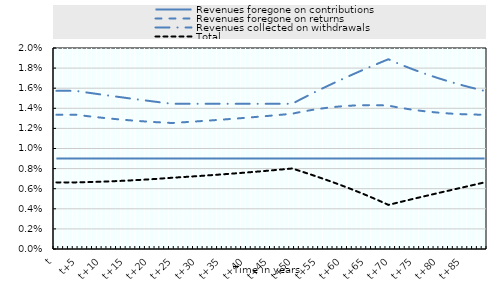
| Category | Revenues foregone on contributions | Revenues foregone on returns | Revenues collected on withdrawals | Total |
|---|---|---|---|---|
| t | 0.009 | 0.013 | 0.016 | 0.007 |
|  | 0.009 | 0.013 | 0.016 | 0.007 |
|  | 0.009 | 0.013 | 0.016 | 0.007 |
|  | 0.009 | 0.013 | 0.016 | 0.007 |
|  | 0.009 | 0.013 | 0.016 | 0.007 |
| t+5 | 0.009 | 0.013 | 0.016 | 0.007 |
|  | 0.009 | 0.013 | 0.016 | 0.007 |
|  | 0.009 | 0.013 | 0.016 | 0.007 |
|  | 0.009 | 0.013 | 0.015 | 0.007 |
|  | 0.009 | 0.013 | 0.015 | 0.007 |
| t+10 | 0.009 | 0.013 | 0.015 | 0.007 |
|  | 0.009 | 0.013 | 0.015 | 0.007 |
|  | 0.009 | 0.013 | 0.015 | 0.007 |
|  | 0.009 | 0.013 | 0.015 | 0.007 |
|  | 0.009 | 0.013 | 0.015 | 0.007 |
| t+15 | 0.009 | 0.013 | 0.015 | 0.007 |
|  | 0.009 | 0.013 | 0.015 | 0.007 |
|  | 0.009 | 0.013 | 0.015 | 0.007 |
|  | 0.009 | 0.013 | 0.015 | 0.007 |
|  | 0.009 | 0.013 | 0.015 | 0.007 |
| t+20 | 0.009 | 0.013 | 0.015 | 0.007 |
|  | 0.009 | 0.013 | 0.015 | 0.007 |
|  | 0.009 | 0.013 | 0.015 | 0.007 |
|  | 0.009 | 0.013 | 0.015 | 0.007 |
|  | 0.009 | 0.013 | 0.014 | 0.007 |
| t+25 | 0.009 | 0.013 | 0.014 | 0.007 |
|  | 0.009 | 0.013 | 0.014 | 0.007 |
|  | 0.009 | 0.013 | 0.014 | 0.007 |
|  | 0.009 | 0.013 | 0.014 | 0.007 |
|  | 0.009 | 0.013 | 0.014 | 0.007 |
| t+30 | 0.009 | 0.013 | 0.014 | 0.007 |
|  | 0.009 | 0.013 | 0.014 | 0.007 |
|  | 0.009 | 0.013 | 0.014 | 0.007 |
|  | 0.009 | 0.013 | 0.014 | 0.007 |
|  | 0.009 | 0.013 | 0.014 | 0.007 |
| t+35 | 0.009 | 0.013 | 0.014 | 0.007 |
|  | 0.009 | 0.013 | 0.014 | 0.007 |
|  | 0.009 | 0.013 | 0.014 | 0.008 |
|  | 0.009 | 0.013 | 0.014 | 0.008 |
|  | 0.009 | 0.013 | 0.014 | 0.008 |
| t+40 | 0.009 | 0.013 | 0.014 | 0.008 |
|  | 0.009 | 0.013 | 0.014 | 0.008 |
|  | 0.009 | 0.013 | 0.014 | 0.008 |
|  | 0.009 | 0.013 | 0.014 | 0.008 |
|  | 0.009 | 0.013 | 0.014 | 0.008 |
| t+45 | 0.009 | 0.013 | 0.014 | 0.008 |
|  | 0.009 | 0.013 | 0.014 | 0.008 |
|  | 0.009 | 0.013 | 0.014 | 0.008 |
|  | 0.009 | 0.013 | 0.014 | 0.008 |
|  | 0.009 | 0.013 | 0.014 | 0.008 |
| t+50 | 0.009 | 0.014 | 0.015 | 0.008 |
|  | 0.009 | 0.014 | 0.015 | 0.008 |
|  | 0.009 | 0.014 | 0.015 | 0.008 |
|  | 0.009 | 0.014 | 0.015 | 0.007 |
|  | 0.009 | 0.014 | 0.016 | 0.007 |
| t+55 | 0.009 | 0.014 | 0.016 | 0.007 |
|  | 0.009 | 0.014 | 0.016 | 0.007 |
|  | 0.009 | 0.014 | 0.016 | 0.007 |
|  | 0.009 | 0.014 | 0.017 | 0.007 |
|  | 0.009 | 0.014 | 0.017 | 0.006 |
| t+60 | 0.009 | 0.014 | 0.017 | 0.006 |
|  | 0.009 | 0.014 | 0.017 | 0.006 |
|  | 0.009 | 0.014 | 0.017 | 0.006 |
|  | 0.009 | 0.014 | 0.018 | 0.006 |
|  | 0.009 | 0.014 | 0.018 | 0.005 |
| t+65 | 0.009 | 0.014 | 0.018 | 0.005 |
|  | 0.009 | 0.014 | 0.018 | 0.005 |
|  | 0.009 | 0.014 | 0.018 | 0.005 |
|  | 0.009 | 0.014 | 0.019 | 0.005 |
|  | 0.009 | 0.014 | 0.019 | 0.004 |
| t+70 | 0.009 | 0.014 | 0.019 | 0.005 |
|  | 0.009 | 0.014 | 0.018 | 0.005 |
|  | 0.009 | 0.014 | 0.018 | 0.005 |
|  | 0.009 | 0.014 | 0.018 | 0.005 |
|  | 0.009 | 0.014 | 0.018 | 0.005 |
| t+75 | 0.009 | 0.014 | 0.018 | 0.005 |
|  | 0.009 | 0.014 | 0.018 | 0.005 |
|  | 0.009 | 0.014 | 0.017 | 0.005 |
|  | 0.009 | 0.014 | 0.017 | 0.005 |
|  | 0.009 | 0.014 | 0.017 | 0.006 |
| t+80 | 0.009 | 0.014 | 0.017 | 0.006 |
|  | 0.009 | 0.014 | 0.017 | 0.006 |
|  | 0.009 | 0.013 | 0.017 | 0.006 |
|  | 0.009 | 0.013 | 0.016 | 0.006 |
|  | 0.009 | 0.013 | 0.016 | 0.006 |
| t+85 | 0.009 | 0.013 | 0.016 | 0.006 |